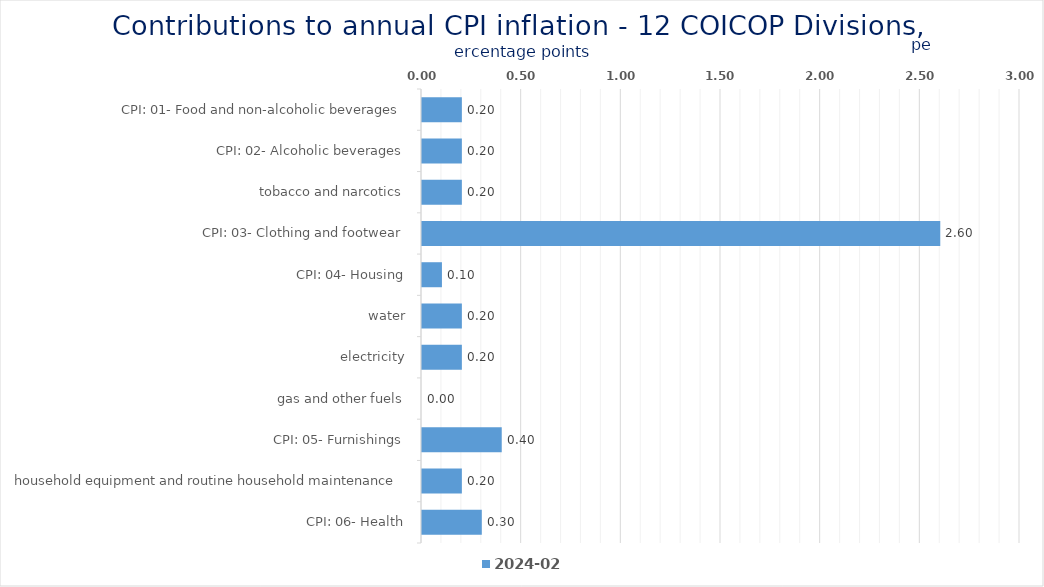
| Category | 2024-02 |
|---|---|
| CPI: 01- Food and non-alcoholic beverages | 0.2 |
| CPI: 02- Alcoholic beverages, tobacco and narcotics | 0.2 |
| CPI: 03- Clothing and footwear | 0.2 |
| CPI: 04- Housing, water, electricity, gas and other fuels | 2.6 |
| CPI: 05- Furnishings, household equipment and routine household maintenance | 0.1 |
| CPI: 06- Health | 0.2 |
| CPI: 07- Transport | 0.2 |
| CPI: 08- Communication | 0 |
| CPI: 09- Recreation and culture | 0.4 |
| CPI: 11- Restaurants and hotels | 0.2 |
| CPI: 12- Miscellaneous goods and services | 0.3 |